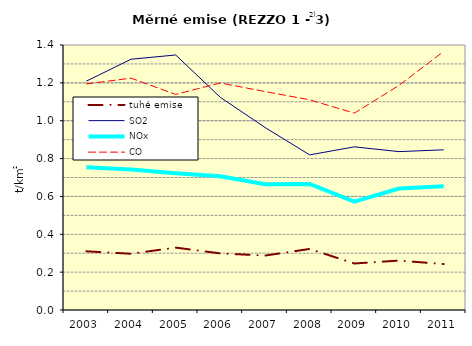
| Category | tuhé emise | SO2 | NOx | CO |
|---|---|---|---|---|
| 2003.0 | 0.31 | 1.209 | 0.755 | 1.194 |
| 2004.0 | 0.297 | 1.325 | 0.742 | 1.225 |
| 2005.0 | 0.33 | 1.347 | 0.722 | 1.139 |
| 2006.0 | 0.299 | 1.123 | 0.707 | 1.199 |
| 2007.0 | 0.288 | 0.964 | 0.664 | 1.154 |
| 2008.0 | 0.323 | 0.82 | 0.666 | 1.11 |
| 2009.0 | 0.246 | 0.862 | 0.572 | 1.04 |
| 2010.0 | 0.261 | 0.837 | 0.642 | 1.187 |
| 2011.0 | 0.243 | 0.846 | 0.654 | 1.366 |